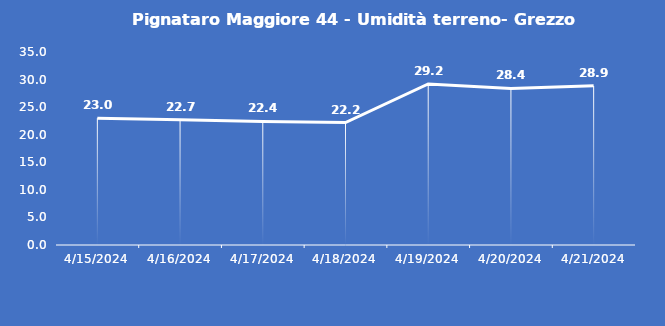
| Category | Pignataro Maggiore 44 - Umidità terreno- Grezzo (%VWC) |
|---|---|
| 4/15/24 | 23 |
| 4/16/24 | 22.7 |
| 4/17/24 | 22.4 |
| 4/18/24 | 22.2 |
| 4/19/24 | 29.2 |
| 4/20/24 | 28.4 |
| 4/21/24 | 28.9 |